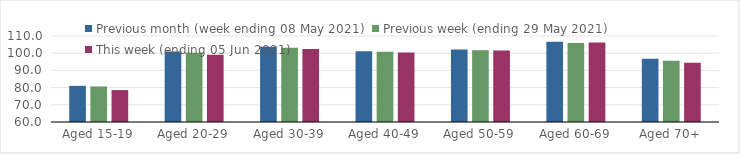
| Category | Previous month (week ending 08 May 2021) | Previous week (ending 29 May 2021) | This week (ending 05 Jun 2021) |
|---|---|---|---|
| Aged 15-19 | 81.02 | 80.68 | 78.56 |
| Aged 20-29 | 100.96 | 100.29 | 99.03 |
| Aged 30-39 | 103.69 | 103.11 | 102.49 |
| Aged 40-49 | 101.19 | 100.85 | 100.47 |
| Aged 50-59 | 102.2 | 101.68 | 101.57 |
| Aged 60-69 | 106.62 | 105.98 | 106.24 |
| Aged 70+ | 96.83 | 95.57 | 94.45 |